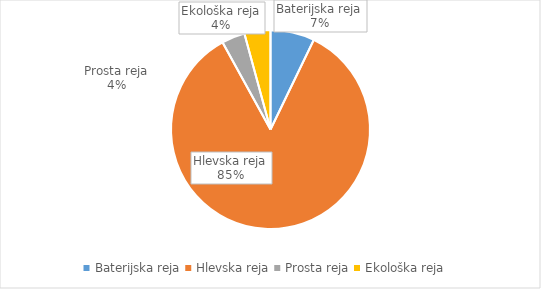
| Category | Količina kosov jajc |
|---|---|
| Baterijska reja | 302107 |
| Hlevska reja | 3578617 |
| Prosta reja | 159343 |
| Ekološka reja | 178520 |